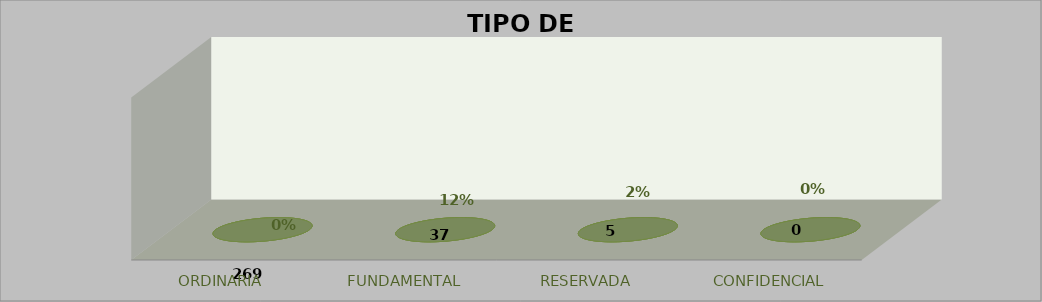
| Category | Series 0 | Series 2 | Series 3 | Series 1 |
|---|---|---|---|---|
| ORDINARIA |  | 0 | 0 |  |
| FUNDAMENTAL |  | 0 | 0 |  |
| RESERVADA |  | 0 | 0 |  |
| CONFIDENCIAL |  | 0 | 0 |  |